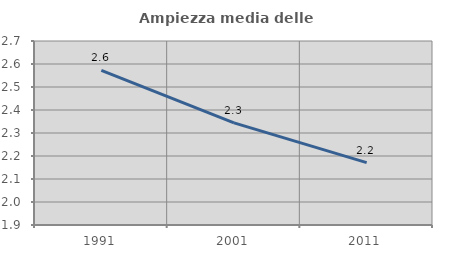
| Category | Ampiezza media delle famiglie |
|---|---|
| 1991.0 | 2.572 |
| 2001.0 | 2.344 |
| 2011.0 | 2.171 |